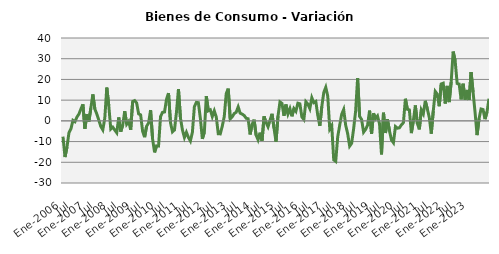
| Category | Series 0 |
|---|---|
| Ene-2006 | -7.617 |
|  | -17.473 |
|  | -12.662 |
|  | -5.714 |
|  | -3.83 |
|  | 0.237 |
| Jul | -0.419 |
|  | 1.822 |
|  | 3.261 |
|  | 5.754 |
|  | 7.962 |
|  | -3.796 |
| Ene-2007 | 3.193 |
|  | -0.391 |
|  | 6.221 |
|  | 12.765 |
|  | 5.717 |
|  | 3.311 |
| Jul | 0.345 |
|  | -2.732 |
|  | -4.341 |
|  | 1.321 |
|  | 16.066 |
|  | 7.364 |
| Ene-2008 | -3.963 |
|  | -3.041 |
|  | -4.442 |
|  | -5.76 |
|  | 1.648 |
|  | -5.209 |
| Jul | -2.088 |
|  | 4.676 |
|  | -1.625 |
|  | -0.265 |
|  | -4.319 |
|  | 9.345 |
| Ene-2009 | 9.78 |
|  | 8.625 |
|  | 3.354 |
|  | 2.884 |
|  | -5.032 |
|  | -7.886 |
| Jul | -2.565 |
|  | -1.063 |
|  | 5.197 |
|  | -8.716 |
|  | -15.214 |
|  | -12.086 |
| Ene-2010 | -12.156 |
|  | 2.083 |
|  | 4.109 |
|  | 4.284 |
|  | 10.414 |
|  | 13.41 |
| Jul | -0.855 |
|  | -5.302 |
|  | -4.381 |
|  | 4.168 |
|  | 15.342 |
|  | 1.351 |
| Ene-2011 | -4.391 |
|  | -8.021 |
|  | -5.522 |
|  | -7.989 |
|  | -9.706 |
|  | -5.495 |
| Jul | 6.873 |
|  | 8.914 |
|  | 8.785 |
|  | 1.239 |
|  | -8.674 |
|  | -5.541 |
| Ene-2012 | 11.926 |
|  | 4.879 |
|  | 5.353 |
|  | 2.056 |
|  | 4.836 |
|  | 1.867 |
| Jul | -6.209 |
|  | -6.289 |
|  | -2.615 |
|  | 2.009 |
|  | 13.151 |
|  | 15.549 |
| Ene-2013 | 0.924 |
|  | 1.951 |
|  | 3.53 |
|  | 4.16 |
|  | 6.738 |
|  | 3.721 |
| Jul | 3.262 |
|  | 2.594 |
|  | 1.267 |
|  | 1.001 |
|  | -6.571 |
|  | -1.745 |
| Ene-2014 | 0.57 |
|  | -6.87 |
|  | -9.175 |
|  | -5.704 |
|  | -9.61 |
|  | 2.156 |
| Jul | -0.758 |
|  | -2.866 |
|  | 0.297 |
|  | 3.411 |
|  | -3.52 |
|  | -10.024 |
| Ene-2015 | 2.283 |
|  | 9.128 |
|  | 8.433 |
|  | 2.46 |
|  | 7.898 |
|  | 3.336 |
| Jul | 5.881 |
|  | 2.2 |
|  | 5.929 |
|  | 4.616 |
|  | 8.522 |
|  | 8.209 |
| Ene-2016 | 1.852 |
|  | 0.632 |
|  | 9.246 |
|  | 8.117 |
|  | 5.912 |
|  | 11.18 |
| Jul | 8.797 |
|  | 9.357 |
|  | 2.569 |
|  | -2.431 |
|  | 6.829 |
|  | 13.72 |
| Ene-2017 | 16.185 |
|  | 11.946 |
|  | -3.953 |
|  | -2.325 |
|  | -18.822 |
|  | -19.563 |
| Jul | -7.735 |
|  | -2.091 |
|  | 3.208 |
|  | 5.486 |
|  | -2.105 |
|  | -6.155 |
| Ene-2018 | -12.208 |
|  | -10.836 |
|  | -3.785 |
|  | 4.747 |
|  | 20.618 |
|  | 2.163 |
| Jul | 0.647 |
|  | -5.465 |
|  | -4.169 |
|  | -2.082 |
|  | 4.943 |
|  | -6.305 |
| Ene-2019 | 3.653 |
|  | 1.043 |
|  | 2.352 |
|  | -1.432 |
|  | -16.198 |
|  | 3.926 |
| Jul | -5.868 |
|  | 0.717 |
|  | -4.841 |
|  | -9.216 |
|  | -10.549 |
|  | -2.739 |
| Ene-2020 | -3.562 |
|  | -3.359 |
|  | -1.939 |
|  | -0.874 |
|  | 10.661 |
|  | 5.59 |
| Jul | 5.29 |
|  | -5.915 |
|  | 0.059 |
|  | 7.438 |
|  | -1.174 |
|  | -4.123 |
| Ene-2021 | 5.28 |
|  | 3.391 |
|  | 9.685 |
|  | 5.792 |
|  | 1.682 |
|  | -6.179 |
| Jul | 4.732 |
|  | 14.203 |
|  | 12.906 |
|  | 7.063 |
|  | 17.811 |
|  | 18.187 |
| Ene-2022 | 8.377 |
|  | 16.879 |
|  | 9.054 |
|  | 18.791 |
|  | 33.447 |
|  | 28.982 |
| Jul | 18.059 |
|  | 17.765 |
|  | 10.387 |
|  | 17.925 |
|  | 10.258 |
|  | 14.914 |
| Ene-2023 | 10.111 |